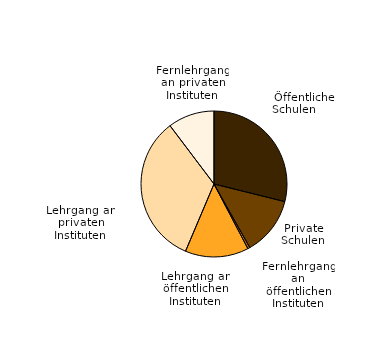
| Category | Series 0 |
|---|---|
| Öffentliche Schulen | 727 |
| Private Schulen | 326 |
| Fernlehrgang an öffentlichen Instituten | 12 |
| Lehrgang an öffentlichen Instituten | 354 |
| Lehrgang an privaten Instituten | 839 |
| Fernlehrgang an privaten Instituten | 259 |